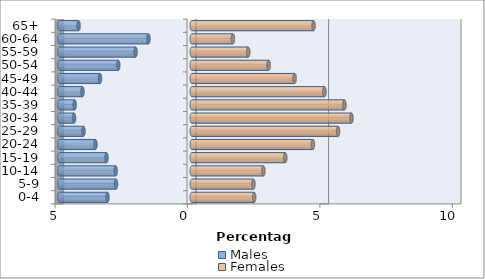
| Category | Males | Females |
|---|---|---|
| 0-4 | -3.182 | 2.357 |
| 5-9 | -2.86 | 2.327 |
| 10-14 | -2.874 | 2.703 |
| 15-19 | -3.219 | 3.529 |
| 20-24 | -3.636 | 4.572 |
| 25-29 | -4.09 | 5.522 |
| 30-34 | -4.445 | 6.029 |
| 35-39 | -4.421 | 5.762 |
| 40-44 | -4.127 | 5.009 |
| 45-49 | -3.465 | 3.882 |
| 50-54 | -2.775 | 2.903 |
| 55-59 | -2.121 | 2.133 |
| 60-64 | -1.637 | 1.552 |
| 65+ | -4.273 | 4.597 |